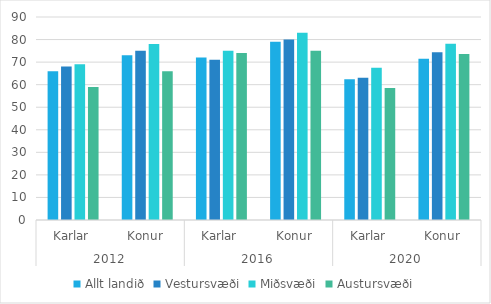
| Category | Allt landið | Vestursvæði | Miðsvæði | Austursvæði |
|---|---|---|---|---|
| 0 | 66 | 68 | 69 | 59 |
| 1 | 73 | 75 | 78 | 66 |
| 2 | 72 | 71 | 75 | 74 |
| 3 | 79 | 80 | 83 | 75 |
| 4 | 62.4 | 63.028 | 67.474 | 58.525 |
| 5 | 71.5 | 74.362 | 78.159 | 73.585 |